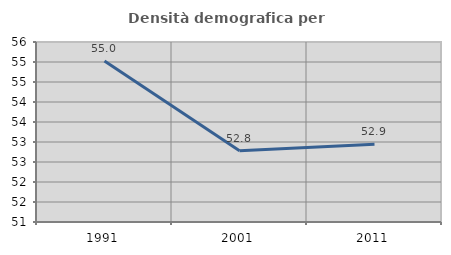
| Category | Densità demografica |
|---|---|
| 1991.0 | 55.022 |
| 2001.0 | 52.78 |
| 2011.0 | 52.944 |